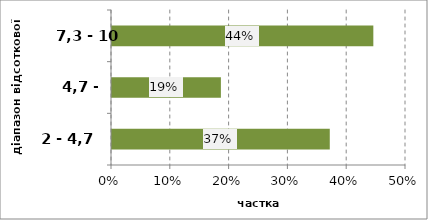
| Category | Series 0 |
|---|---|
| 2 - 4,7 | 0.37 |
| 4,7 - 7,3 | 0.185 |
| 7,3 - 10 | 0.444 |